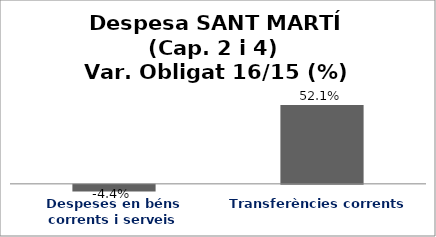
| Category | Series 0 |
|---|---|
| Despeses en béns corrents i serveis | -0.044 |
| Transferències corrents | 0.521 |